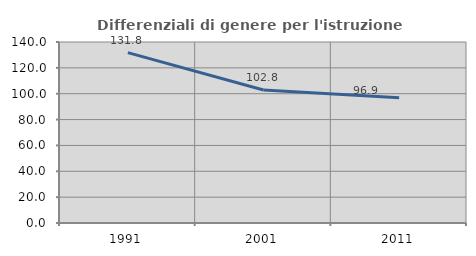
| Category | Differenziali di genere per l'istruzione superiore |
|---|---|
| 1991.0 | 131.75 |
| 2001.0 | 102.82 |
| 2011.0 | 96.928 |